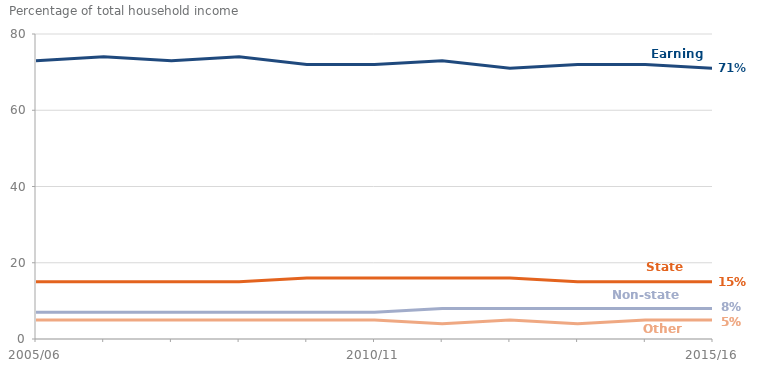
| Category | Earnings | State support | Non-state pensions | Other sources |
|---|---|---|---|---|
| 2005/06 | 73 | 15 | 7 | 5 |
| 2006/07 | 74 | 15 | 7 | 5 |
| 2007/08 | 73 | 15 | 7 | 5 |
| 2008/09 | 74 | 15 | 7 | 5 |
| 2009/10 | 72 | 16 | 7 | 5 |
| 2010/11 | 72 | 16 | 7 | 5 |
| 2011/12 | 73 | 16 | 8 | 4 |
| 2012/13 | 71 | 16 | 8 | 5 |
| 2013/14 | 72 | 15 | 8 | 4 |
| 2014/15 | 72 | 15 | 8 | 5 |
| 2015/16 | 71 | 15 | 8 | 5 |